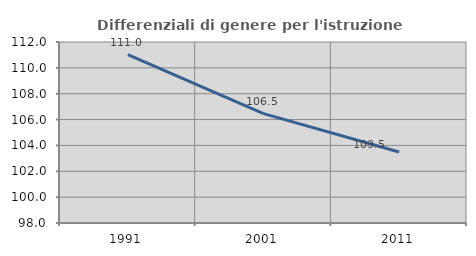
| Category | Differenziali di genere per l'istruzione superiore |
|---|---|
| 1991.0 | 111.026 |
| 2001.0 | 106.458 |
| 2011.0 | 103.492 |